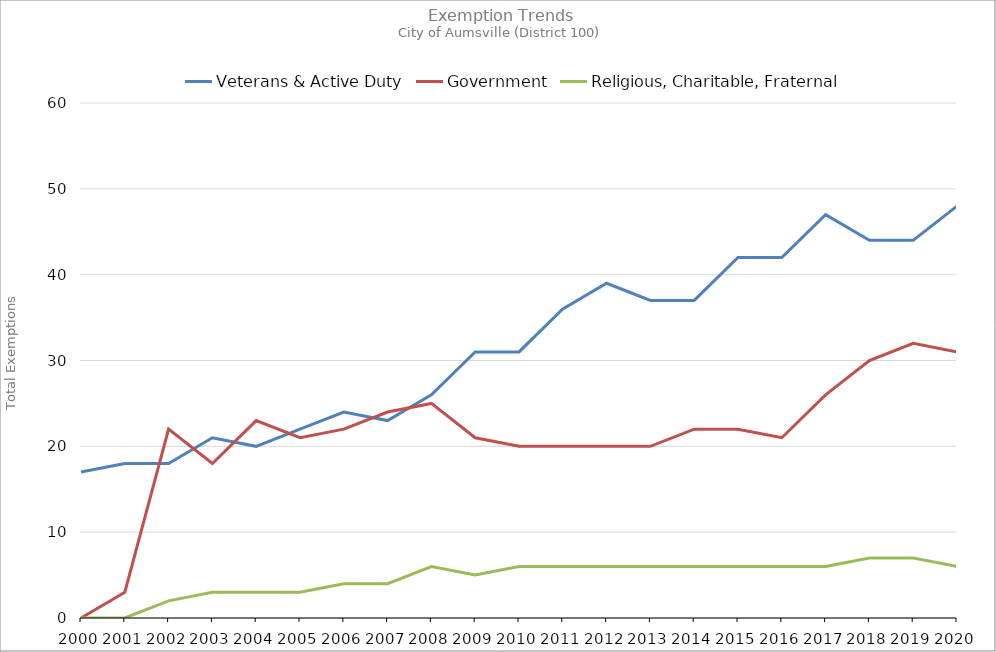
| Category | Veterans & Active Duty | Government | Religious, Charitable, Fraternal |
|---|---|---|---|
| 2000.0 | 17 | 0 | 0 |
| 2001.0 | 18 | 3 | 0 |
| 2002.0 | 18 | 22 | 2 |
| 2003.0 | 21 | 18 | 3 |
| 2004.0 | 20 | 23 | 3 |
| 2005.0 | 22 | 21 | 3 |
| 2006.0 | 24 | 22 | 4 |
| 2007.0 | 23 | 24 | 4 |
| 2008.0 | 26 | 25 | 6 |
| 2009.0 | 31 | 21 | 5 |
| 2010.0 | 31 | 20 | 6 |
| 2011.0 | 36 | 20 | 6 |
| 2012.0 | 39 | 20 | 6 |
| 2013.0 | 37 | 20 | 6 |
| 2014.0 | 37 | 22 | 6 |
| 2015.0 | 42 | 22 | 6 |
| 2016.0 | 42 | 21 | 6 |
| 2017.0 | 47 | 26 | 6 |
| 2018.0 | 44 | 30 | 7 |
| 2019.0 | 44 | 32 | 7 |
| 2020.0 | 48 | 31 | 6 |